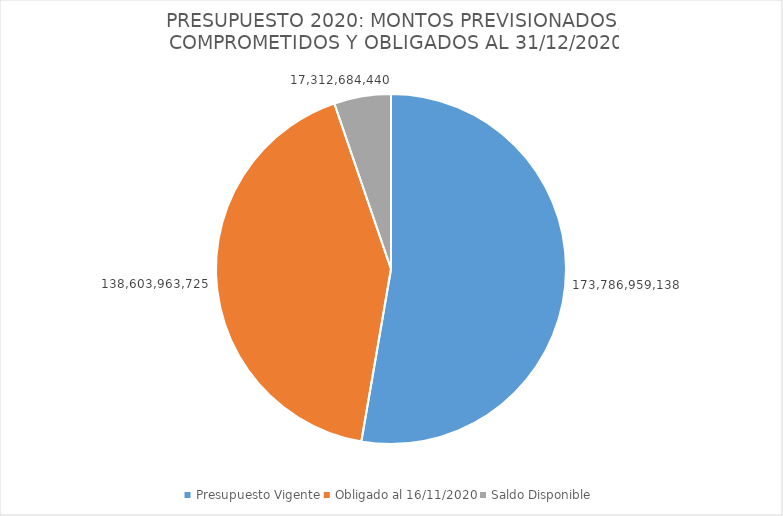
| Category | Series 0 |
|---|---|
| Presupuesto Vigente | 173786959138 |
| Obligado al 16/11/2020 | 138603963725 |
| Saldo Disponible | 17312684440 |